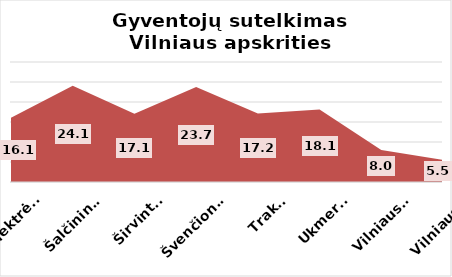
| Category | Series 0 |
|---|---|
| Elektrėnai | 16.07 |
| Šalčininkai | 24.05 |
| Širvintos | 17.08 |
| Švenčionys | 23.73 |
| Trakai | 17.15 |
| Ukmergė | 18.14 |
| Vilniaus r. | 8.02 |
| Vilniaus m. | 5.51 |